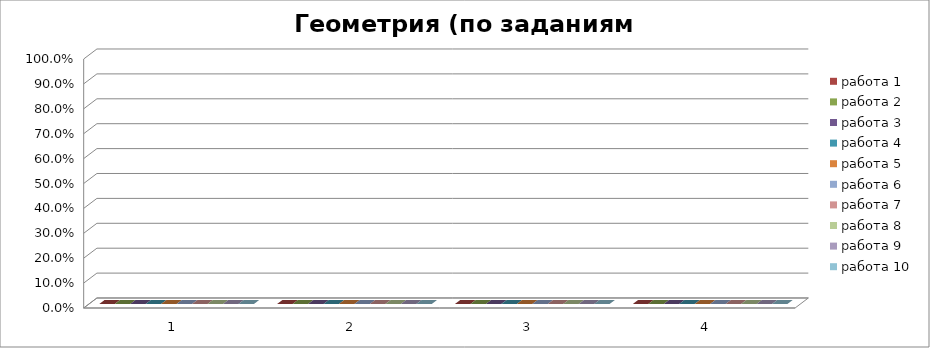
| Category | работа 1 | работа 2 | работа 3 | работа 4 | работа 5 | работа 6 | работа 7 | работа 8 | работа 9 | работа 10 |
|---|---|---|---|---|---|---|---|---|---|---|
| 0 | 0 | 0 | 0 | 0 | 0 | 0 | 0 | 0 | 0 | 0 |
| 1 | 0 | 0 | 0 | 0 | 0 | 0 | 0 | 0 | 0 | 0 |
| 2 | 0 | 0 | 0 | 0 | 0 | 0 | 0 | 0 | 0 | 0 |
| 3 | 0 | 0 | 0 | 0 | 0 | 0 | 0 | 0 | 0 | 0 |